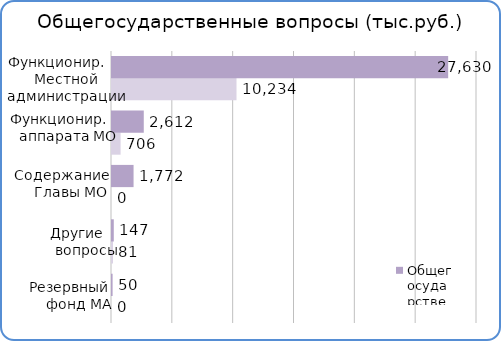
| Category | Факт | План  |
|---|---|---|
| Резервный фонд МА | 0 | 50000 |
| Другие вопросы | 81000 | 146800 |
| Содержание Главы МО | 0 | 1772300 |
| Функционирование аппарата МО | 706400 | 2611800 |
| Функционирование МА | 10233900 | 27630000 |